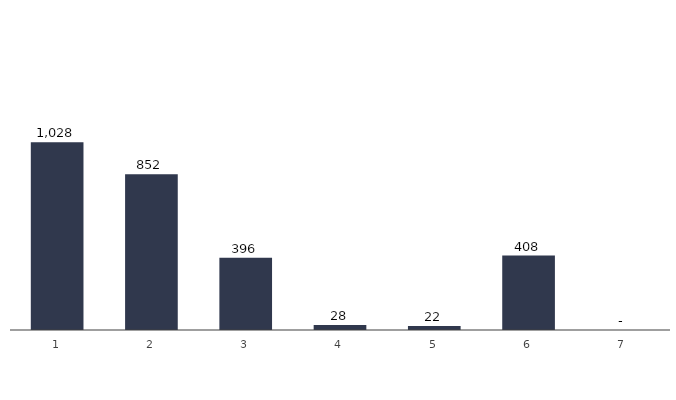
| Category | Series 0 |
|---|---|
| 0 | 1028.116 |
| 1 | 852.487 |
| 2 | 395.59 |
| 3 | 27.544 |
| 4 | 21.637 |
| 5 | 407.716 |
| 6 | 165.456 |
| 7 | 10.172 |